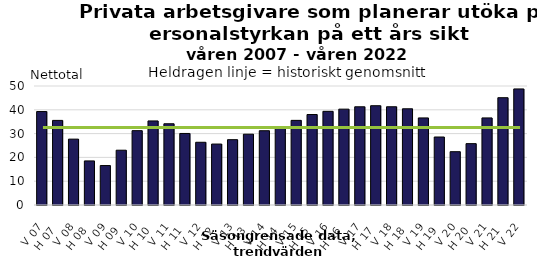
| Category | Nettotal |
|---|---|
| V 07 | 39.264 |
| H 07 | 35.549 |
| V 08 | 27.672 |
| H 08 | 18.517 |
| V 09 | 16.572 |
| H 09 | 23.017 |
| V 10 | 31.233 |
| H 10 | 35.322 |
| V 11 | 34.135 |
| H 11 | 30.061 |
| V 12 | 26.357 |
| H 12 | 25.605 |
| V 13 | 27.443 |
| H 13 | 29.748 |
| V 14 | 31.208 |
| H 14 | 32.791 |
| V 15 | 35.558 |
| H 15 | 38.013 |
| V 16 | 39.355 |
| H 16 | 40.274 |
| V 17 | 41.262 |
| H 17 | 41.717 |
| V 18 | 41.28 |
| H 18 | 40.427 |
| V 19 | 36.589 |
| H 19 | 28.57 |
| V 20 | 22.4 |
| H 20 | 25.781 |
| V 21 | 36.593 |
| H 21 | 45.088 |
| V 22 | 48.771 |